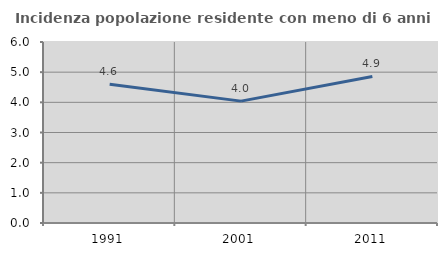
| Category | Incidenza popolazione residente con meno di 6 anni |
|---|---|
| 1991.0 | 4.603 |
| 2001.0 | 4.04 |
| 2011.0 | 4.858 |